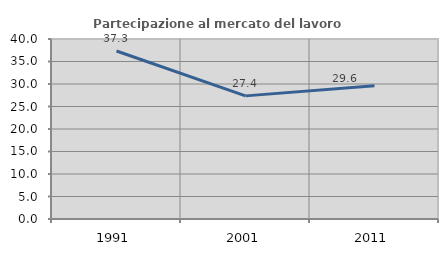
| Category | Partecipazione al mercato del lavoro  femminile |
|---|---|
| 1991.0 | 37.332 |
| 2001.0 | 27.361 |
| 2011.0 | 29.59 |